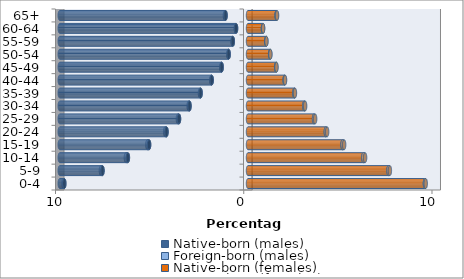
| Category | Native-born (males) | Foreign-born (males) | Native-born (females) | Foreign-born (females) |
|---|---|---|---|---|
| 0-4 | -9.759 | -0.048 | 9.398 | 0.043 |
| 5-9 | -7.73 | -0.085 | 7.461 | 0.075 |
| 10-14 | -6.38 | -0.107 | 6.125 | 0.095 |
| 15-19 | -5.254 | -0.093 | 5.022 | 0.085 |
| 20-24 | -4.329 | -0.073 | 4.135 | 0.069 |
| 25-29 | -3.665 | -0.06 | 3.508 | 0.059 |
| 30-34 | -3.107 | -0.046 | 2.99 | 0.045 |
| 35-39 | -2.518 | -0.034 | 2.462 | 0.032 |
| 40-44 | -1.927 | -0.026 | 1.945 | 0.024 |
| 45-49 | -1.399 | -0.02 | 1.495 | 0.018 |
| 50-54 | -1.027 | -0.016 | 1.175 | 0.015 |
| 55-59 | -0.806 | -0.013 | 0.967 | 0.012 |
| 60-64 | -0.635 | -0.012 | 0.795 | 0.01 |
| 65+ | -1.191 | -0.036 | 1.517 | 0.028 |